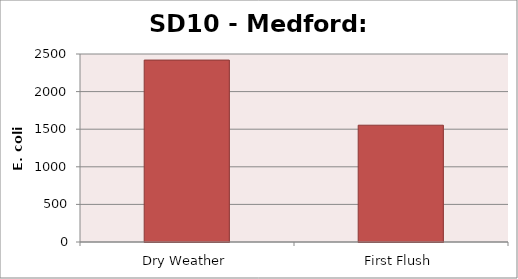
| Category | E. coli MPN |
|---|---|
| Dry Weather | 2419.2 |
| First Flush | 1553.1 |